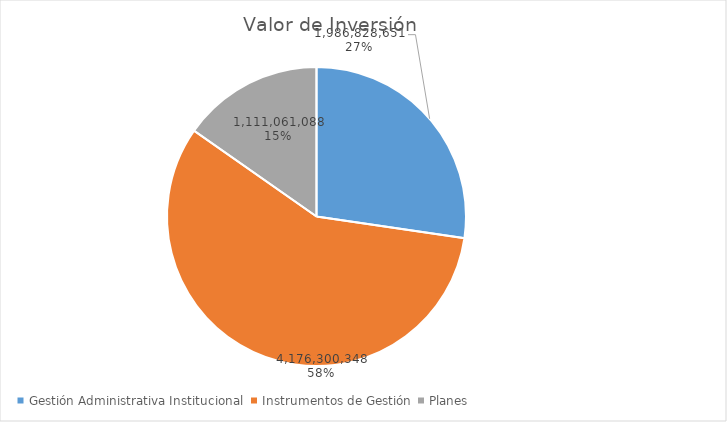
| Category | Valor de Inversión | Porcentaje de Ejecución dentro de la Actividad |
|---|---|---|
| Gestión Administrativa Institucional | 1986828651 | 6 |
| Instrumentos de Gestión | 4176300348 | 14 |
| Planes | 1111061088 | 10 |